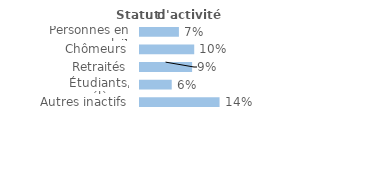
| Category | Series 0 |
|---|---|
| Personnes en emploi¹ | 0.07 |
| Chômeurs | 0.097 |
| Retraités | 0.094 |
| Étudiants, élèves | 0.057 |
| Autres inactifs  | 0.143 |